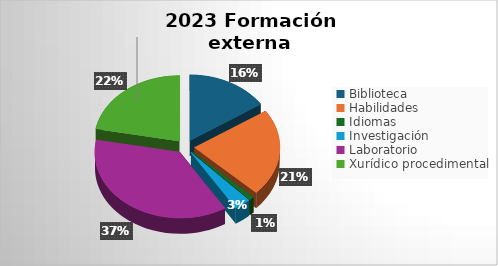
| Category | Series 0 |
|---|---|
| Biblioteca | 3719.33 |
| Habilidades | 5114.68 |
| Idiomas | 220 |
| Investigación | 743.97 |
| Laboratorio | 8756.94 |
| Xurídico procedimental | 5240.72 |